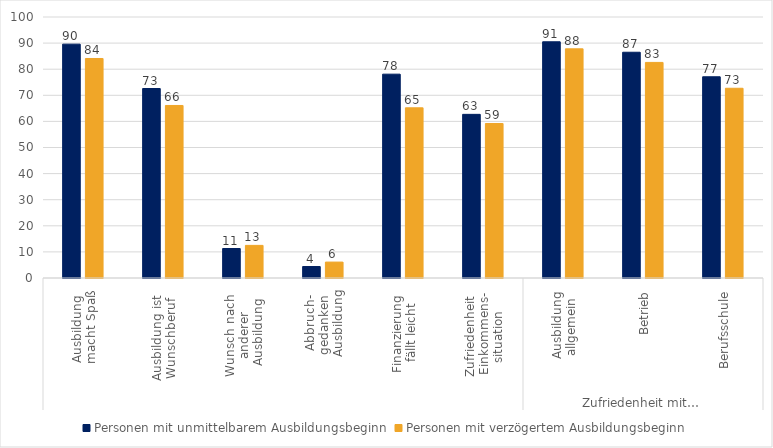
| Category | Personen mit unmittelbarem Ausbildungsbeginn | Personen mit verzögertem Ausbildungsbeginn |
|---|---|---|
| 0 | 89.6 | 84.1 |
| 1 | 72.6 | 66.1 |
| 2 | 11.3 | 12.5 |
| 3 | 4.4 | 6.1 |
| 4 | 78.1 | 65.2 |
| 5 | 62.7 | 59.2 |
| 6 | 90.5 | 87.8 |
| 7 | 86.5 | 82.6 |
| 8 | 77.1 | 72.7 |